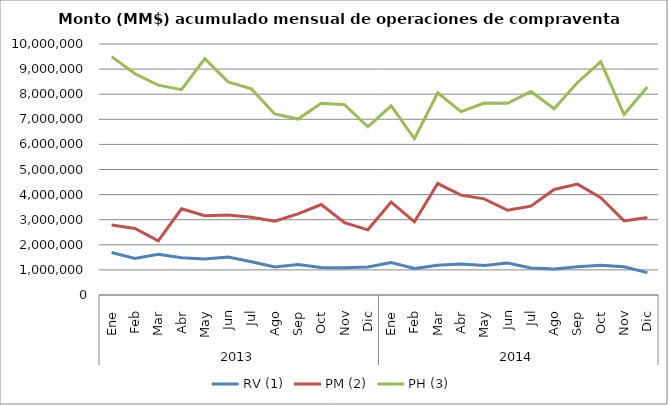
| Category | RV (1) | PM (2) | PH (3) |
|---|---|---|---|
| 0 | 1693090.019 | 2788692.01 | 9495719.157 |
| 1 | 1457870.523 | 2652319.476 | 8814454.346 |
| 2 | 1619570.46 | 2155113.626 | 8361658.957 |
| 3 | 1485677.791 | 3434435.881 | 8182321.991 |
| 4 | 1434943.507 | 3155786.06 | 9417818.094 |
| 5 | 1516566.545 | 3191285.457 | 8490151.421 |
| 6 | 1322115.523 | 3099755.507 | 8212010.547 |
| 7 | 1118245.895 | 2937089.197 | 7211658.784 |
| 8 | 1215047.725 | 3232334.418 | 7008526.172 |
| 9 | 1092035.083 | 3603082.09 | 7640993.748 |
| 10 | 1088055.605 | 2879188.198 | 7583918.365 |
| 11 | 1114851.326 | 2596986.123 | 6700659.979 |
| 12 | 1296256.43 | 3700290.091 | 7538361.261 |
| 13 | 1061199.219 | 2915830.381 | 6230064.605 |
| 14 | 1189463.212 | 4440910.02 | 8058380.739 |
| 15 | 1231035.305 | 3977428.452 | 7305106.144 |
| 16 | 1178985.046 | 3830415.456 | 7649023.753 |
| 17 | 1271543.287 | 3377453.657 | 7635505.378 |
| 18 | 1074038.901 | 3538491.307 | 8103978.154 |
| 19 | 1039238.343 | 4203748.491 | 7419437.742 |
| 20 | 1122686.945 | 4418671.366 | 8468015.825 |
| 21 | 1187018.073 | 3874404.728 | 9290296.839 |
| 22 | 1122986.318 | 2952125.236 | 7191905.475 |
| 23 | 890188.327 | 3091535.537 | 8284976.218 |